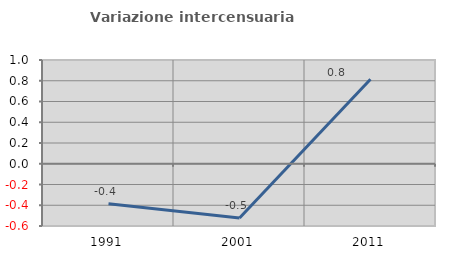
| Category | Variazione intercensuaria annua |
|---|---|
| 1991.0 | -0.385 |
| 2001.0 | -0.523 |
| 2011.0 | 0.815 |